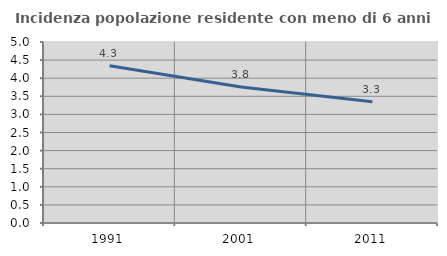
| Category | Incidenza popolazione residente con meno di 6 anni |
|---|---|
| 1991.0 | 4.345 |
| 2001.0 | 3.759 |
| 2011.0 | 3.35 |